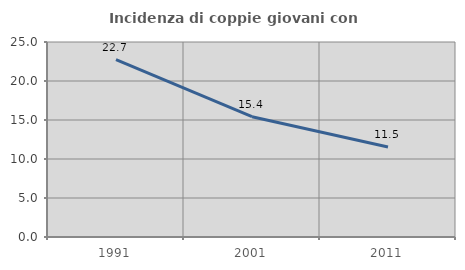
| Category | Incidenza di coppie giovani con figli |
|---|---|
| 1991.0 | 22.739 |
| 2001.0 | 15.419 |
| 2011.0 | 11.534 |